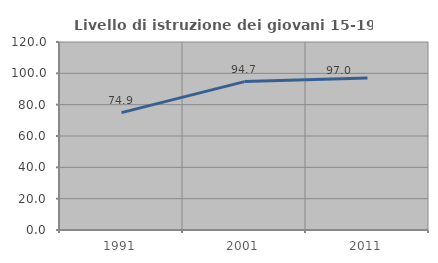
| Category | Livello di istruzione dei giovani 15-19 anni |
|---|---|
| 1991.0 | 74.922 |
| 2001.0 | 94.722 |
| 2011.0 | 97.031 |